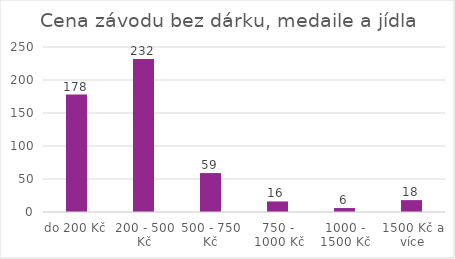
| Category | Series 0 |
|---|---|
| do 200 Kč | 178 |
| 200 - 500 Kč | 232 |
| 500 - 750 Kč | 59 |
| 750 - 1000 Kč | 16 |
| 1000 - 1500 Kč | 6 |
| 1500 Kč a více | 18 |